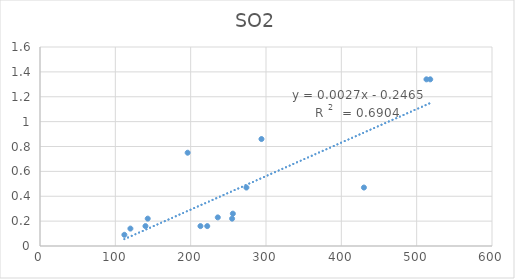
| Category | SO2 |
|---|---|
| 112.0 | 0.09 |
| 140.0 | 0.16 |
| 143.0 | 0.22 |
| 120.0 | 0.14 |
| 196.0 | 0.75 |
| 294.0 | 0.86 |
| 513.0 | 1.34 |
| 518.0 | 1.34 |
| 430.0 | 0.47 |
| 274.0 | 0.47 |
| 255.0 | 0.22 |
| 236.0 | 0.23 |
| 256.0 | 0.26 |
| 222.0 | 0.16 |
| 213.0 | 0.16 |